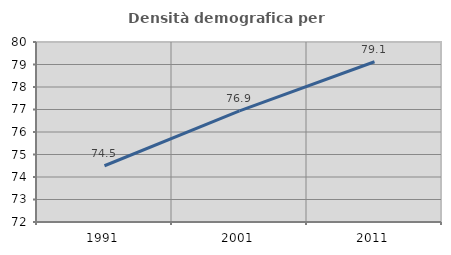
| Category | Densità demografica |
|---|---|
| 1991.0 | 74.5 |
| 2001.0 | 76.935 |
| 2011.0 | 79.121 |